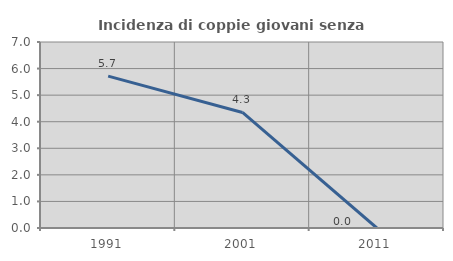
| Category | Incidenza di coppie giovani senza figli |
|---|---|
| 1991.0 | 5.714 |
| 2001.0 | 4.348 |
| 2011.0 | 0 |